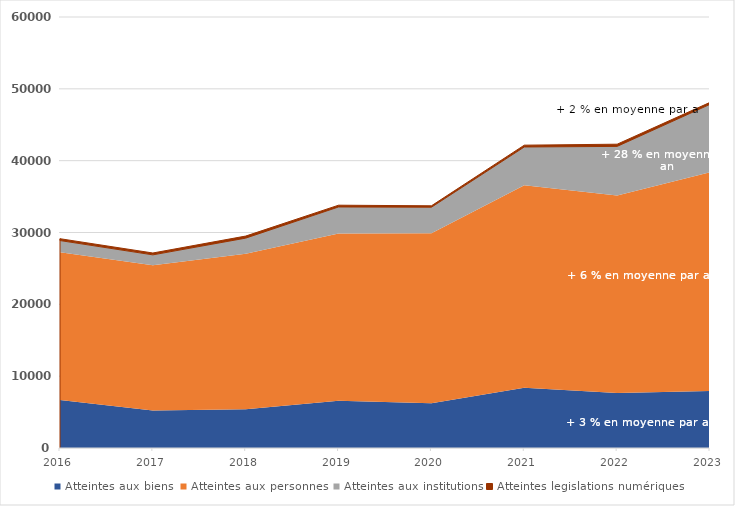
| Category | Atteintes aux biens  | Atteintes aux personnes  | Atteintes aux institutions | Atteintes legislations numériques |
|---|---|---|---|---|
| 2016.0 | 6677 | 20567 | 1635 | 257 |
| 2017.0 | 5233 | 20198 | 1455 | 262 |
| 2018.0 | 5411 | 21633 | 2172 | 289 |
| 2019.0 | 6583 | 23271 | 3702 | 245 |
| 2020.0 | 6233 | 23647 | 3638 | 199 |
| 2021.0 | 8404 | 28173 | 5329 | 253 |
| 2022.0 | 7647 | 27513 | 6826 | 308 |
| 2023.0 | 7947 | 30450 | 9445 | 271 |